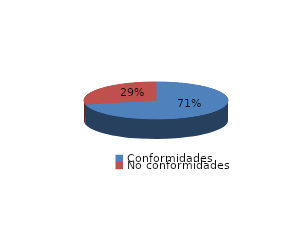
| Category | Series 0 |
|---|---|
| Conformidades | 2859 |
| No conformidades | 1141 |